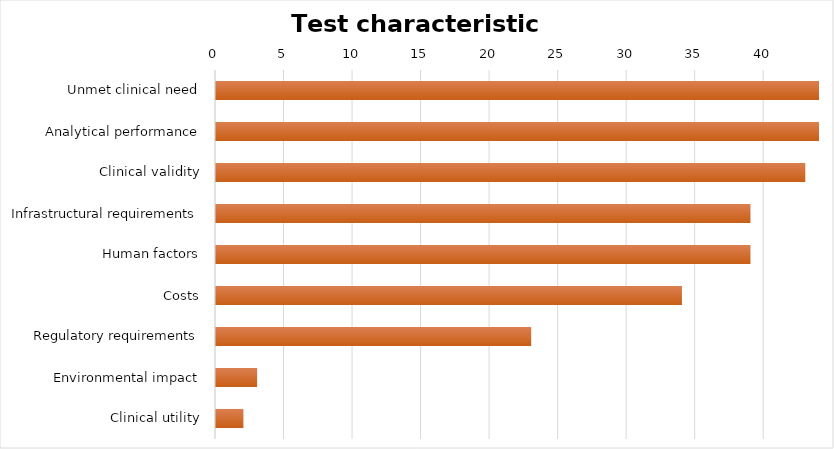
| Category | Series 0 |
|---|---|
| Unmet clinical need | 44 |
| Analytical performance | 44 |
| Clinical validity | 43 |
| Infrastructural requirements | 39 |
| Human factors | 39 |
| Costs | 34 |
| Regulatory requirements | 23 |
| Environmental impact | 3 |
| Clinical utility | 2 |